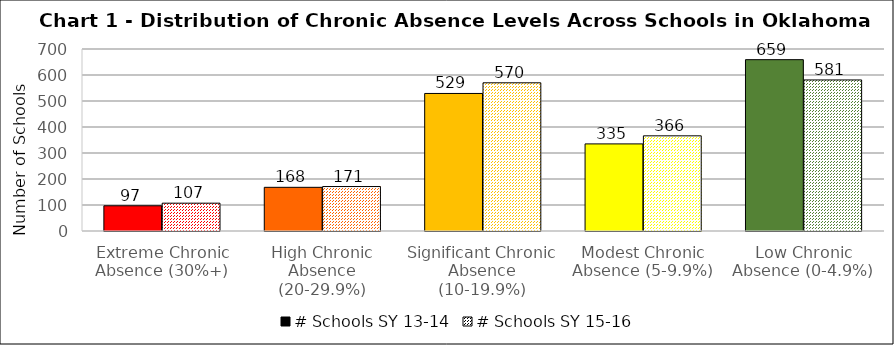
| Category | # Schools SY 13-14 | # Schools SY 15-16 |
|---|---|---|
| Extreme Chronic Absence (30%+) | 97 | 107 |
| High Chronic Absence (20-29.9%) | 168 | 171 |
| Significant Chronic Absence (10-19.9%) | 529 | 570 |
| Modest Chronic Absence (5-9.9%) | 335 | 366 |
| Low Chronic Absence (0-4.9%) | 659 | 581 |